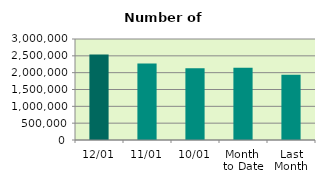
| Category | Series 0 |
|---|---|
| 12/01 | 2539124 |
| 11/01 | 2269744 |
| 10/01 | 2129860 |
| Month 
to Date | 2147277.111 |
| Last
Month | 1934937.048 |